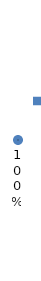
| Category | Series 0 |
|---|---|
| Total | 31 |